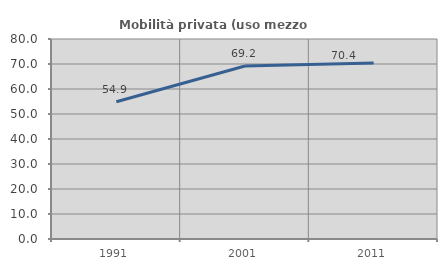
| Category | Mobilità privata (uso mezzo privato) |
|---|---|
| 1991.0 | 54.917 |
| 2001.0 | 69.2 |
| 2011.0 | 70.411 |